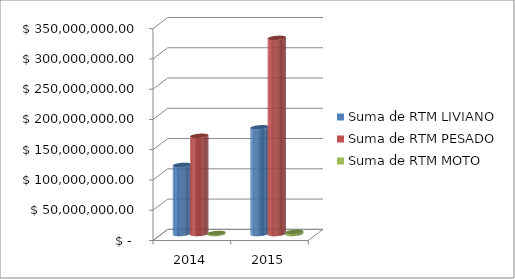
| Category | Suma de RTM LIVIANO | Suma de RTM PESADO | Suma de RTM MOTO |
|---|---|---|---|
| 2014 | 114144000 | 162225000 | 1675000 |
| 2015 | 176320000 | 324030000 | 3475000 |